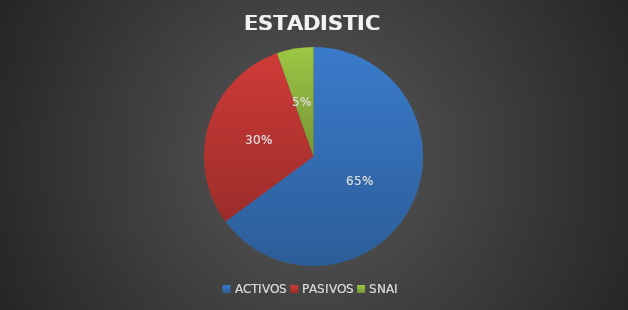
| Category | Series 0 |
|---|---|
| ACTIVOS | 24 |
| PASIVOS | 11 |
| SNAI | 2 |